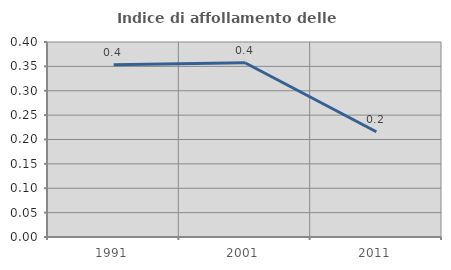
| Category | Indice di affollamento delle abitazioni  |
|---|---|
| 1991.0 | 0.354 |
| 2001.0 | 0.357 |
| 2011.0 | 0.216 |